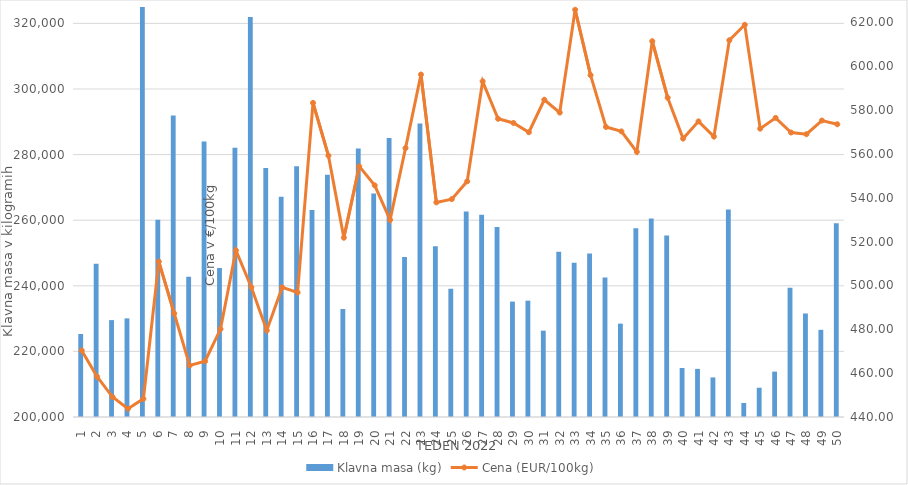
| Category | Klavna masa (kg) |
|---|---|
| 1.0 | 225300 |
| 2.0 | 246712 |
| 3.0 | 229541 |
| 4.0 | 230074 |
| 5.0 | 328640 |
| 6.0 | 260108 |
| 7.0 | 291887 |
| 8.0 | 242732 |
| 9.0 | 283987 |
| 10.0 | 245414 |
| 11.0 | 282092 |
| 12.0 | 321936 |
| 13.0 | 275950 |
| 14.0 | 267148 |
| 15.0 | 276417 |
| 16.0 | 263098 |
| 17.0 | 273824 |
| 18.0 | 232926 |
| 19.0 | 281859 |
| 20.0 | 268153 |
| 21.0 | 285073 |
| 22.0 | 248783 |
| 23.0 | 289478 |
| 24.0 | 252069 |
| 25.0 | 239099 |
| 26.0 | 262689 |
| 27.0 | 261656 |
| 28.0 | 257905 |
| 29.0 | 235185 |
| 30.0 | 235475 |
| 31.0 | 226322 |
| 32.0 | 250418 |
| 33.0 | 246996 |
| 34.0 | 249873 |
| 35.0 | 242516 |
| 36.0 | 228469 |
| 37.0 | 257511 |
| 38.0 | 260481 |
| 39.0 | 255370 |
| 40.0 | 214936 |
| 41.0 | 214672 |
| 42.0 | 212066 |
| 43.0 | 263287 |
| 44.0 | 204280 |
| 45.0 | 208920 |
| 46.0 | 213836 |
| 47.0 | 239417 |
| 48.0 | 231565 |
| 49.0 | 226575 |
| 50.0 | 259073 |